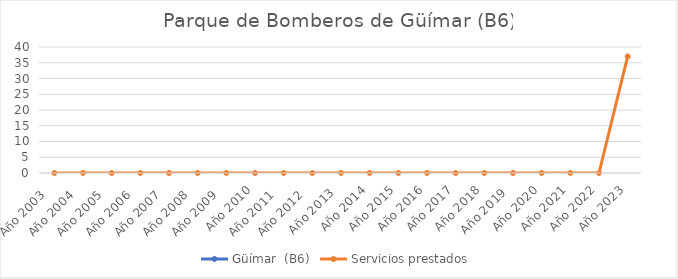
| Category | Güímar  (B6) | Servicios prestados  |
|---|---|---|
| Año 2003   |  | 0 |
| Año 2004   |  | 0 |
| Año 2005   |  | 0 |
| Año 2006   |  | 0 |
| Año 2007   |  | 0 |
| Año 2008   |  | 0 |
| Año 2009   |  | 0 |
| Año 2010 |  | 0 |
| Año 2011   |  | 0 |
| Año 2012   |  | 0 |
| Año 2013  |  | 0 |
| Año 2014 |  | 0 |
| Año 2015 |  | 0 |
| Año 2016 |  | 0 |
| Año 2017 |  | 0 |
| Año 2018 |  | 0 |
| Año 2019  |  | 0 |
| Año 2020 |  | 0 |
| Año 2021 |  | 0 |
| Año 2022 |  | 0 |
| Año 2023 |  | 37 |